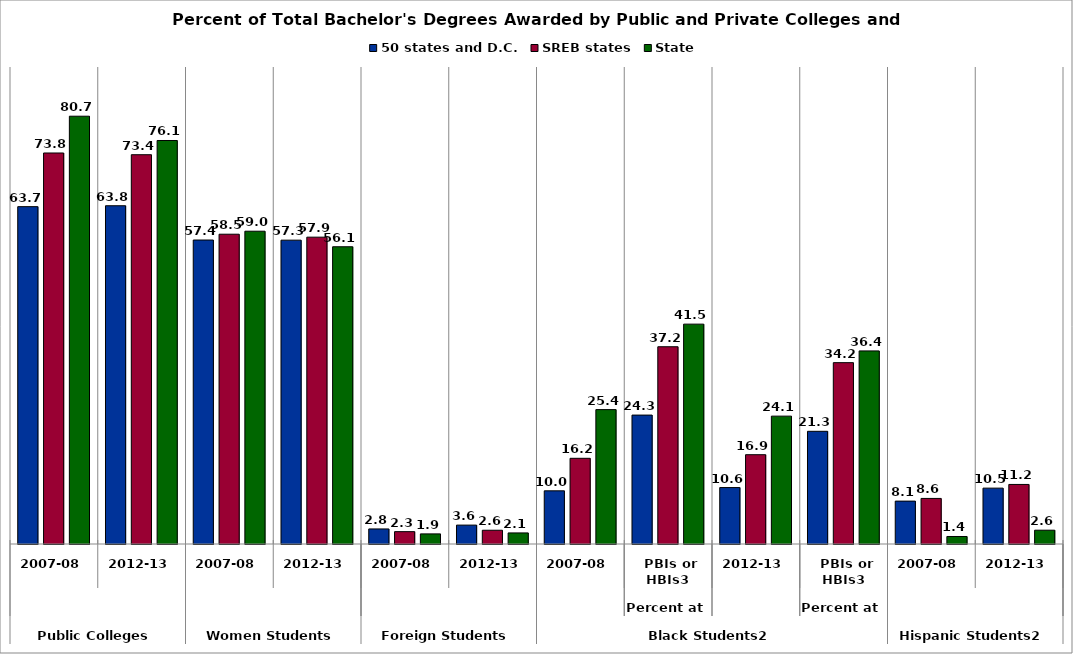
| Category | 50 states and D.C. | SREB states | State |
|---|---|---|---|
| 0 | 63.65 | 73.774 | 80.715 |
| 1 | 63.822 | 73.45 | 76.132 |
| 2 | 57.354 | 58.452 | 59.016 |
| 3 | 57.328 | 57.895 | 56.083 |
| 4 | 2.839 | 2.33 | 1.906 |
| 5 | 3.565 | 2.595 | 2.089 |
| 6 | 10.031 | 16.168 | 25.355 |
| 7 | 24.324 | 37.22 | 41.483 |
| 8 | 10.646 | 16.851 | 24.125 |
| 9 | 21.263 | 34.217 | 36.433 |
| 10 | 8.09 | 8.598 | 1.416 |
| 11 | 10.541 | 11.235 | 2.606 |